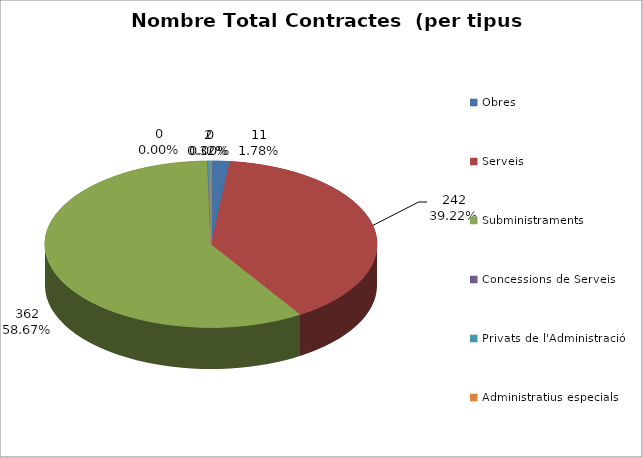
| Category | Nombre Total Contractes |
|---|---|
| Obres | 11 |
| Serveis | 242 |
| Subministraments | 362 |
| Concessions de Serveis | 0 |
| Privats de l'Administració | 2 |
| Administratius especials | 0 |